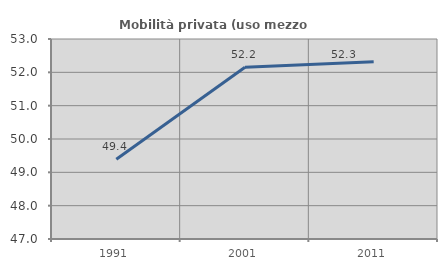
| Category | Mobilità privata (uso mezzo privato) |
|---|---|
| 1991.0 | 49.394 |
| 2001.0 | 52.154 |
| 2011.0 | 52.316 |